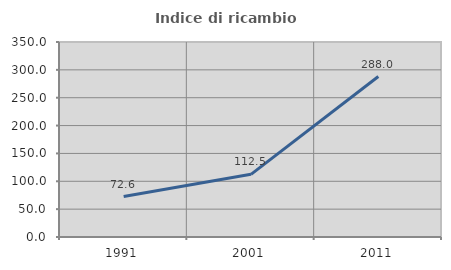
| Category | Indice di ricambio occupazionale  |
|---|---|
| 1991.0 | 72.581 |
| 2001.0 | 112.5 |
| 2011.0 | 288 |